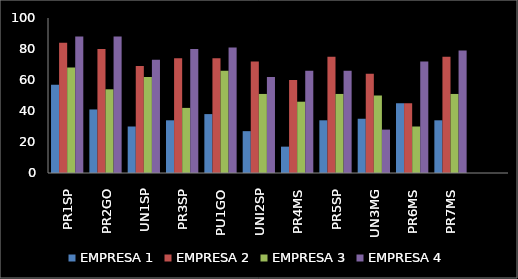
| Category | EMPRESA 1 | EMPRESA 2 | EMPRESA 3 | EMPRESA 4 |
|---|---|---|---|---|
| PR1SP | 57 | 84 | 68 | 88 |
| PR2GO | 41 | 80 | 54 | 88 |
| UN1SP | 30 | 69 | 62 | 73 |
| PR3SP | 34 | 74 | 42 | 80 |
| PU1GO | 38 | 74 | 66 | 81 |
| UNI2SP | 27 | 72 | 51 | 62 |
| PR4MS | 17 | 60 | 46 | 66 |
| PR5SP | 34 | 75 | 51 | 66 |
| UN3MG | 35 | 64 | 50 | 28 |
| PR6MS | 45 | 45 | 30 | 72 |
| PR7MS | 34 | 75 | 51 | 79 |